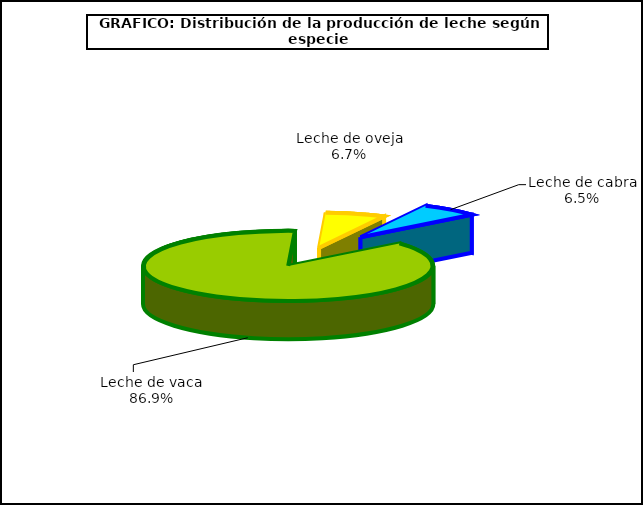
| Category | Leche(según especies) |
|---|---|
| Leche de vaca | 7121.965 |
| Leche de oveja | 545.622 |
| Leche de cabra | 532.515 |